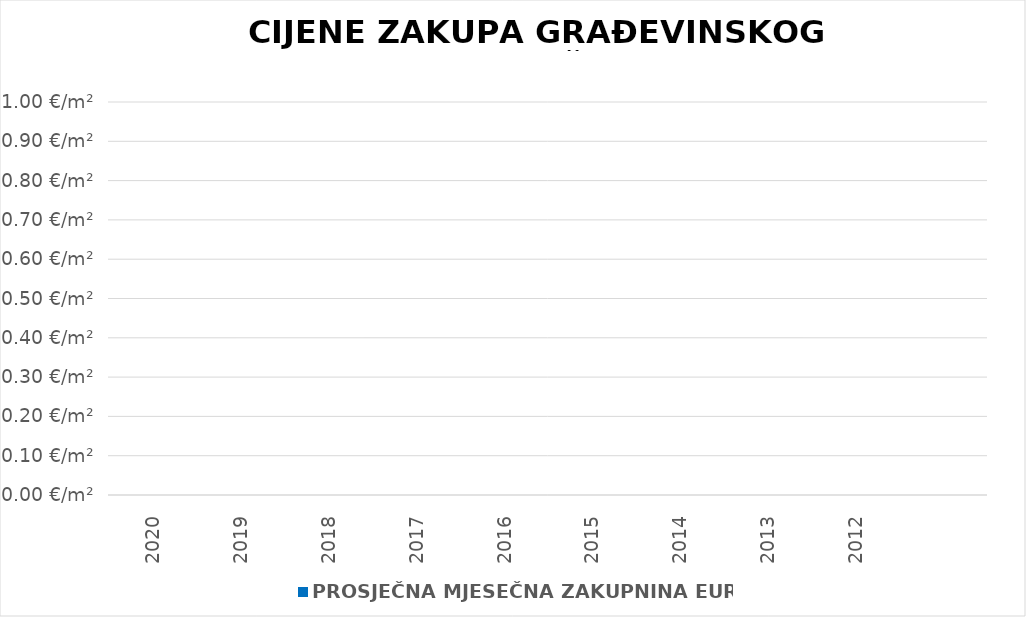
| Category | PROSJEČNA MJESEČNA ZAKUPNINA EUR/m2 |
|---|---|
| 2020 | 0 |
| 2019 | 0 |
| 2018 | 0 |
| 2017 | 0 |
| 2016 | 0 |
| 2015 | 0 |
| 2014 | 0 |
| 2013 | 0 |
| 2012 | 0 |